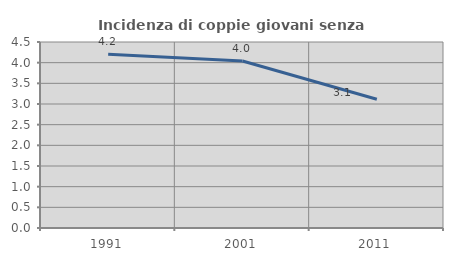
| Category | Incidenza di coppie giovani senza figli |
|---|---|
| 1991.0 | 4.202 |
| 2001.0 | 4.042 |
| 2011.0 | 3.114 |